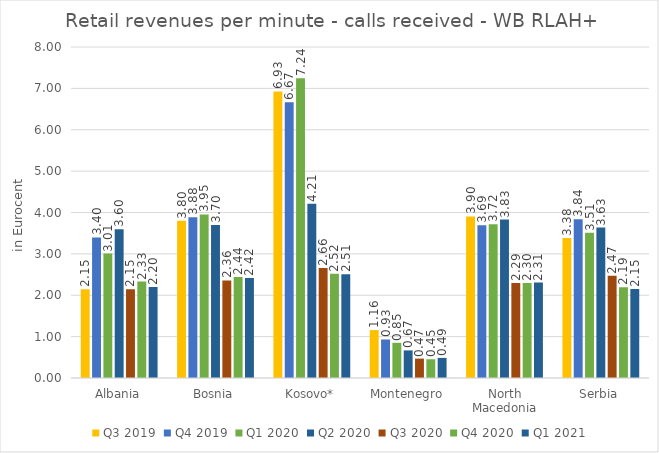
| Category | Q3 2019 | Q4 2019 | Q1 2020 | Q2 2020 | Q3 2020 | Q4 2020 | Q1 2021 |
|---|---|---|---|---|---|---|---|
| Albania | 2.146 | 3.398 | 3.007 | 3.596 | 2.147 | 2.33 | 2.199 |
| Bosnia | 3.802 | 3.882 | 3.953 | 3.696 | 2.359 | 2.439 | 2.416 |
| Kosovo* | 6.927 | 6.666 | 7.245 | 4.214 | 2.66 | 2.519 | 2.508 |
| Montenegro | 1.158 | 0.931 | 0.851 | 0.667 | 0.468 | 0.453 | 0.486 |
| North Macedonia | 3.904 | 3.693 | 3.715 | 3.828 | 2.294 | 2.298 | 2.306 |
| Serbia | 3.383 | 3.837 | 3.508 | 3.635 | 2.472 | 2.193 | 2.151 |